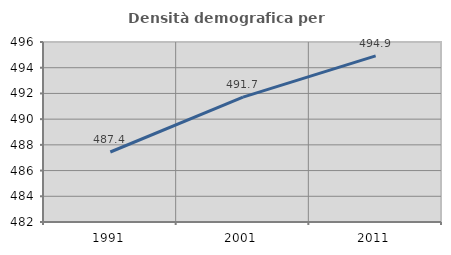
| Category | Densità demografica |
|---|---|
| 1991.0 | 487.444 |
| 2001.0 | 491.714 |
| 2011.0 | 494.917 |